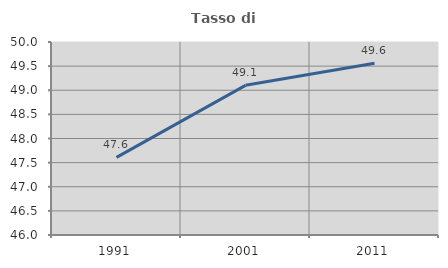
| Category | Tasso di occupazione   |
|---|---|
| 1991.0 | 47.61 |
| 2001.0 | 49.102 |
| 2011.0 | 49.561 |